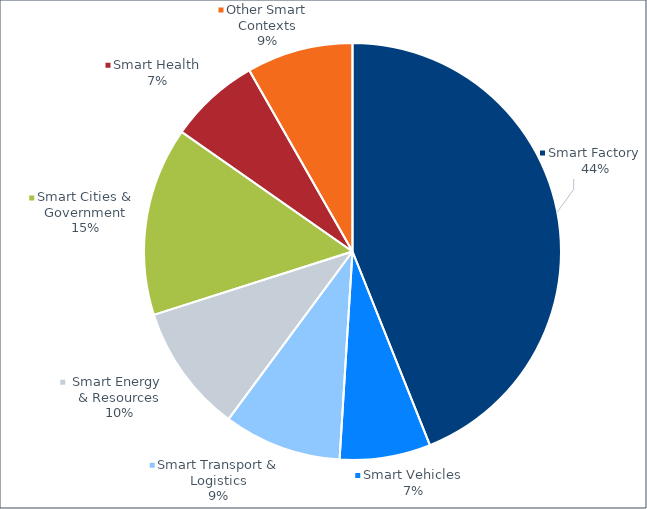
| Category | 2023 |
|---|---|
| Smart Factory | 967.482 |
| Smart Vehicles | 155.104 |
| Smart Transport & Logistics | 201.378 |
| Smart Energy 
& Resources | 219.077 |
| Smart Cities & Government | 322.09 |
| Smart Health | 154.894 |
| Other Smart Contexts | 181.559 |